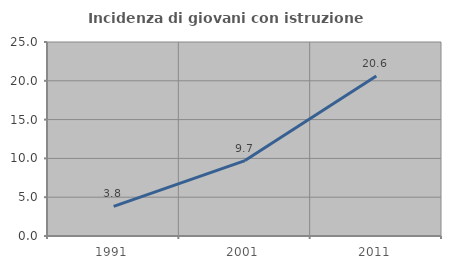
| Category | Incidenza di giovani con istruzione universitaria |
|---|---|
| 1991.0 | 3.814 |
| 2001.0 | 9.717 |
| 2011.0 | 20.611 |